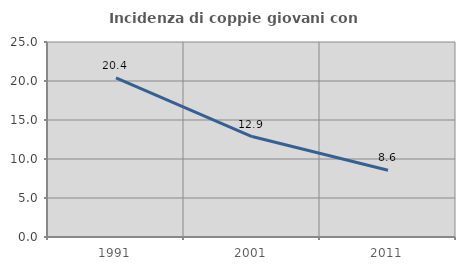
| Category | Incidenza di coppie giovani con figli |
|---|---|
| 1991.0 | 20.398 |
| 2001.0 | 12.881 |
| 2011.0 | 8.551 |